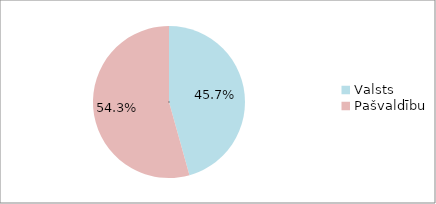
| Category | Series 0 |
|---|---|
| Valsts  | 0.457 |
| Pašvaldību | 0.543 |